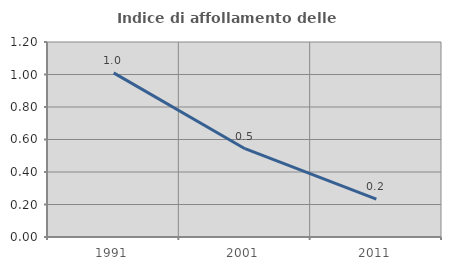
| Category | Indice di affollamento delle abitazioni  |
|---|---|
| 1991.0 | 1.01 |
| 2001.0 | 0.543 |
| 2011.0 | 0.233 |